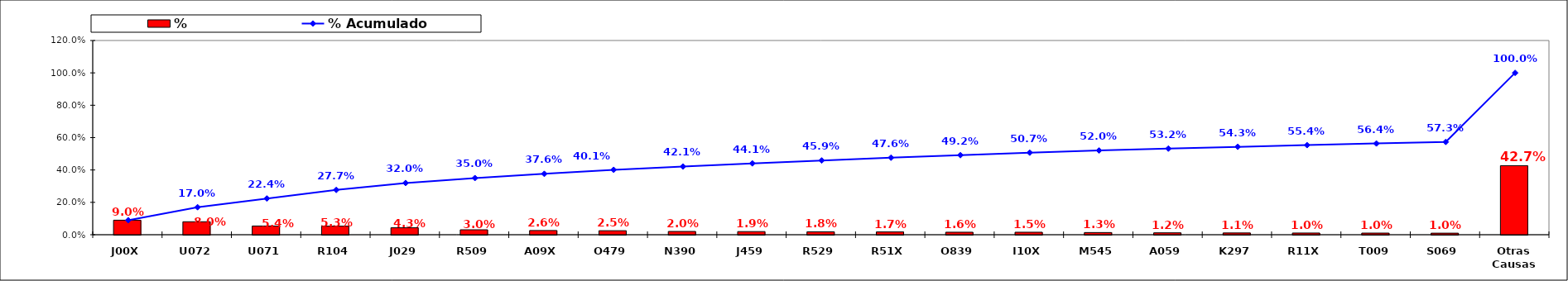
| Category | % |
|---|---|
| J00X | 0.09 |
| U072 | 0.08 |
| U071 | 0.054 |
| R104 | 0.053 |
| J029 | 0.043 |
| R509 | 0.03 |
| A09X | 0.026 |
| O479 | 0.025 |
| N390 | 0.02 |
| J459 | 0.019 |
| R529 | 0.018 |
| R51X | 0.017 |
| O839 | 0.016 |
| I10X | 0.015 |
| M545 | 0.013 |
| A059 | 0.012 |
| K297 | 0.011 |
| R11X | 0.01 |
| T009 | 0.01 |
| S069 | 0.01 |
| Otras Causas | 0.427 |